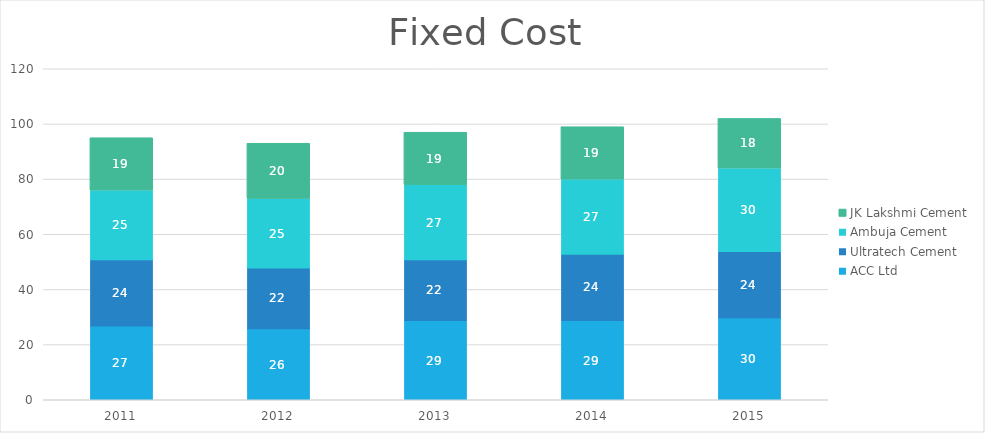
| Category | ACC Ltd | Ultratech Cement | Ambuja Cement | JK Lakshmi Cement |
|---|---|---|---|---|
| 2011 | 27 | 24 | 25 | 19 |
| 2012 | 26 | 22 | 25 | 20 |
| 2013 | 29 | 22 | 27 | 19 |
| 2014 | 29 | 24 | 27 | 19 |
| 2015 | 30 | 24 | 30 | 18 |